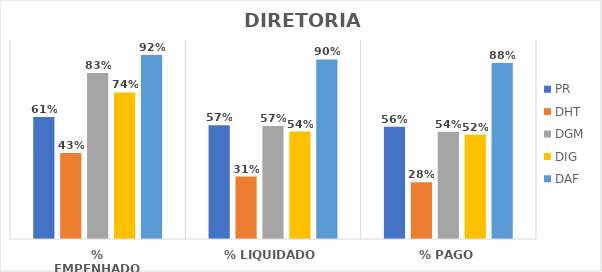
| Category | PR | DHT | DGM | DIG | DAF |
|---|---|---|---|---|---|
| % EMPENHADO | 0.613 | 0.432 | 0.834 | 0.736 | 0.924 |
| % LIQUIDADO | 0.572 | 0.314 | 0.568 | 0.54 | 0.902 |
| % PAGO | 0.565 | 0.285 | 0.539 | 0.524 | 0.885 |